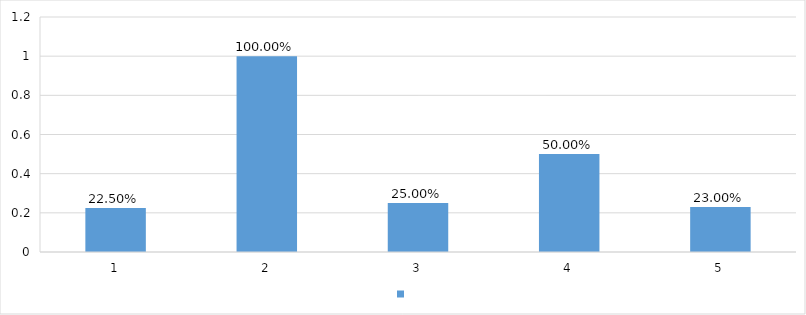
| Category | Series 0 |
|---|---|
| 1 | 0.225 |
| 2 | 1 |
| 3 | 0.25 |
| 4 | 0.5 |
| 5 | 0.23 |